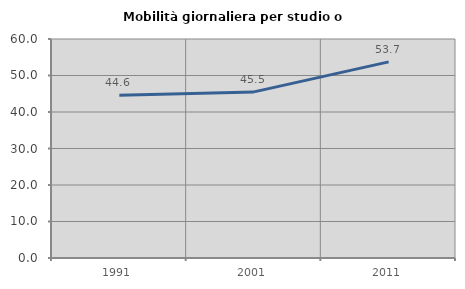
| Category | Mobilità giornaliera per studio o lavoro |
|---|---|
| 1991.0 | 44.604 |
| 2001.0 | 45.511 |
| 2011.0 | 53.723 |